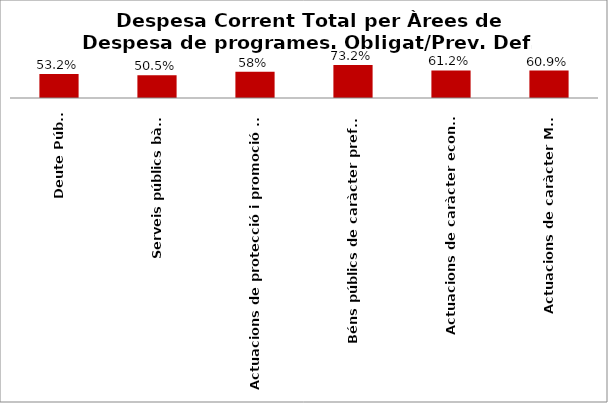
| Category | Series 0 |
|---|---|
| Deute Públic | 0.532 |
| Serveis públics bàsics | 0.505 |
| Actuacions de protecció i promoció social | 0.585 |
| Béns públics de caràcter preferent | 0.732 |
| Actuacions de caràcter econòmic | 0.612 |
| Actuacions de caràcter Marçal | 0.609 |